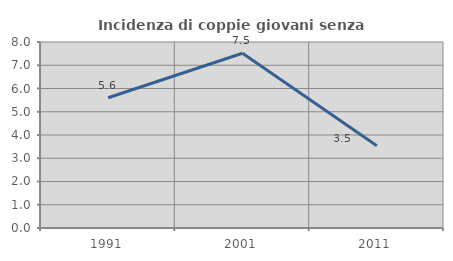
| Category | Incidenza di coppie giovani senza figli |
|---|---|
| 1991.0 | 5.603 |
| 2001.0 | 7.515 |
| 2011.0 | 3.533 |